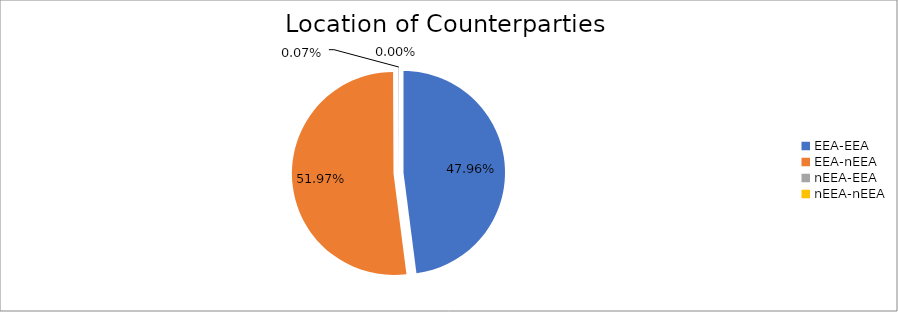
| Category | Series 0 |
|---|---|
| EEA-EEA | 6214865.94 |
| EEA-nEEA | 6733404.504 |
| nEEA-EEA | 9116.693 |
| nEEA-nEEA | 165.166 |